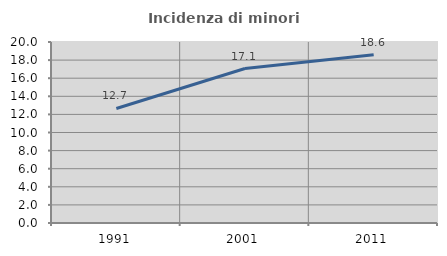
| Category | Incidenza di minori stranieri |
|---|---|
| 1991.0 | 12.653 |
| 2001.0 | 17.067 |
| 2011.0 | 18.587 |